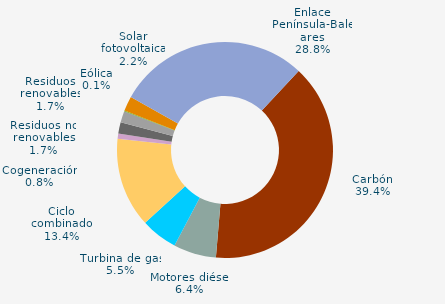
| Category | Series 0 |
|---|---|
| Carbón | 39.4 |
| Motores diésel | 6.4 |
| Turbina de gas | 5.5 |
| Ciclo combinado | 13.4 |
| Generación auxiliar | 0 |
| Cogeneración | 0.8 |
| Residuos no renovables | 1.7 |
| Residuos renovables | 1.7 |
| Eólica | 0.1 |
| Solar fotovoltaica | 2.2 |
| Otras renovables | 0 |
| Enlace Península-Baleares | 28.8 |